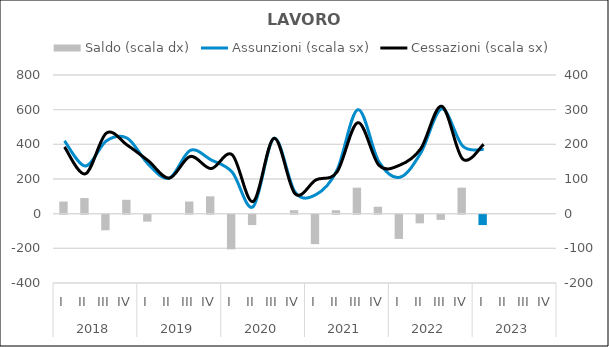
| Category | Saldo (scala dx) |
|---|---|
| 0 | 35 |
| 1 | 45 |
| 2 | -45 |
| 3 | 40 |
| 4 | -20 |
| 5 | 0 |
| 6 | 35 |
| 7 | 50 |
| 8 | -100 |
| 9 | -30 |
| 10 | 0 |
| 11 | 10 |
| 12 | -85 |
| 13 | 10 |
| 14 | 75 |
| 15 | 20 |
| 16 | -70 |
| 17 | -25 |
| 18 | -15 |
| 19 | 75 |
| 20 | -30 |
| 21 | 0 |
| 22 | 0 |
| 23 | 0 |